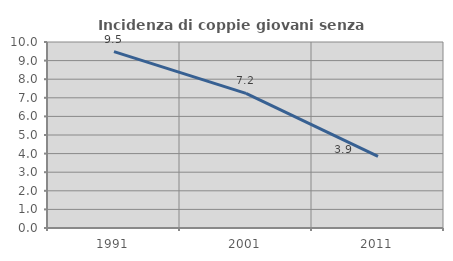
| Category | Incidenza di coppie giovani senza figli |
|---|---|
| 1991.0 | 9.486 |
| 2001.0 | 7.235 |
| 2011.0 | 3.853 |